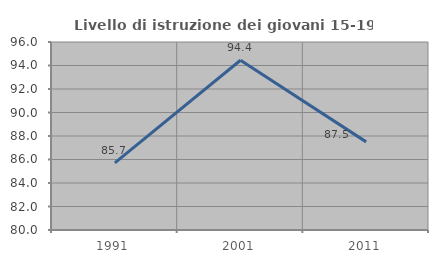
| Category | Livello di istruzione dei giovani 15-19 anni |
|---|---|
| 1991.0 | 85.714 |
| 2001.0 | 94.444 |
| 2011.0 | 87.5 |